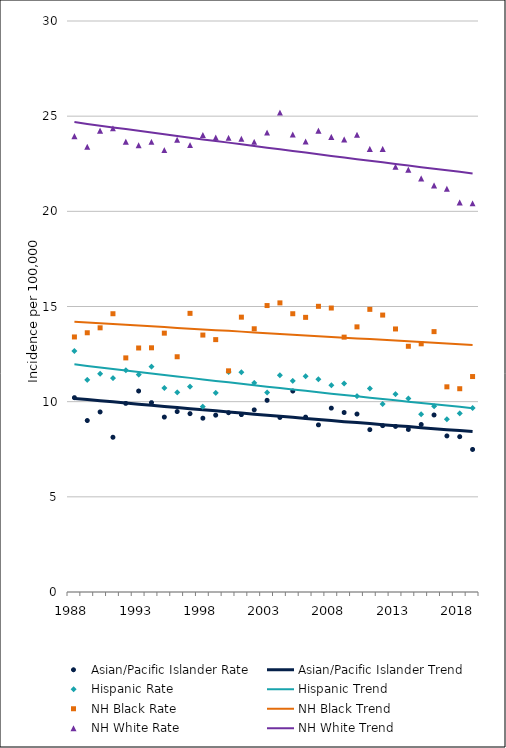
| Category | Asian/Pacific Islander Rate | Asian/Pacific Islander Trend | Hispanic Rate | Hispanic Trend | NH Black Rate | NH Black Trend | NH White Rate | NH White Trend |
|---|---|---|---|---|---|---|---|---|
| 1988.0 | 10.21 | 10.17 | 12.66 | 11.97 | 13.4 | 14.2 | 23.95 | 24.69 |
| 1989.0 | 9.01 | 10.11 | 11.15 | 11.88 | 13.62 | 14.16 | 23.39 | 24.59 |
| 1990.0 | 9.46 | 10.05 | 11.47 | 11.8 | 13.88 | 14.12 | 24.24 | 24.5 |
| 1991.0 | 8.13 | 9.99 | 11.24 | 11.72 | 14.62 | 14.08 | 24.36 | 24.41 |
| 1992.0 | 9.91 | 9.93 | 11.65 | 11.64 | 12.3 | 14.04 | 23.66 | 24.32 |
| 1993.0 | 10.56 | 9.87 | 11.42 | 11.56 | 12.82 | 14 | 23.47 | 24.23 |
| 1994.0 | 9.95 | 9.81 | 11.84 | 11.48 | 12.83 | 13.96 | 23.65 | 24.14 |
| 1995.0 | 9.19 | 9.75 | 10.72 | 11.4 | 13.6 | 13.92 | 23.22 | 24.05 |
| 1996.0 | 9.48 | 9.69 | 10.49 | 11.32 | 12.36 | 13.87 | 23.76 | 23.96 |
| 1997.0 | 9.37 | 9.63 | 10.79 | 11.25 | 14.64 | 13.83 | 23.48 | 23.87 |
| 1998.0 | 9.13 | 9.57 | 9.74 | 11.17 | 13.5 | 13.79 | 24.01 | 23.78 |
| 1999.0 | 9.29 | 9.52 | 10.46 | 11.09 | 13.26 | 13.75 | 23.88 | 23.69 |
| 2000.0 | 9.42 | 9.46 | 11.56 | 11.02 | 11.62 | 13.72 | 23.86 | 23.61 |
| 2001.0 | 9.32 | 9.4 | 11.55 | 10.94 | 14.44 | 13.68 | 23.81 | 23.52 |
| 2002.0 | 9.57 | 9.34 | 10.99 | 10.86 | 13.83 | 13.64 | 23.65 | 23.43 |
| 2003.0 | 10.07 | 9.29 | 10.48 | 10.79 | 15.05 | 13.6 | 24.14 | 23.34 |
| 2004.0 | 9.17 | 9.23 | 11.39 | 10.72 | 15.19 | 13.56 | 25.19 | 23.26 |
| 2005.0 | 10.56 | 9.18 | 11.09 | 10.64 | 14.62 | 13.52 | 24.04 | 23.17 |
| 2006.0 | 9.19 | 9.12 | 11.33 | 10.57 | 14.43 | 13.48 | 23.67 | 23.09 |
| 2007.0 | 8.78 | 9.06 | 11.18 | 10.5 | 15.01 | 13.44 | 24.24 | 23 |
| 2008.0 | 9.66 | 9.01 | 10.86 | 10.42 | 14.92 | 13.4 | 23.91 | 22.91 |
| 2009.0 | 9.43 | 8.95 | 10.96 | 10.35 | 13.39 | 13.36 | 23.78 | 22.83 |
| 2010.0 | 9.35 | 8.9 | 10.29 | 10.28 | 13.93 | 13.32 | 24.02 | 22.74 |
| 2011.0 | 8.53 | 8.85 | 10.69 | 10.21 | 14.85 | 13.29 | 23.28 | 22.66 |
| 2012.0 | 8.74 | 8.79 | 9.88 | 10.14 | 14.55 | 13.25 | 23.28 | 22.58 |
| 2013.0 | 8.7 | 8.74 | 10.4 | 10.07 | 13.82 | 13.21 | 22.34 | 22.49 |
| 2014.0 | 8.54 | 8.69 | 10.17 | 10 | 12.91 | 13.17 | 22.19 | 22.41 |
| 2015.0 | 8.8 | 8.63 | 9.34 | 9.93 | 13.04 | 13.13 | 21.73 | 22.32 |
| 2016.0 | 9.3 | 8.58 | 9.76 | 9.86 | 13.68 | 13.09 | 21.36 | 22.24 |
| 2017.0 | 8.2 | 8.53 | 9.08 | 9.8 | 10.78 | 13.06 | 21.19 | 22.16 |
| 2018.0 | 8.16 | 8.48 | 9.38 | 9.73 | 10.68 | 13.02 | 20.47 | 22.08 |
| 2019.0 | 7.49 | 8.43 | 9.67 | 9.66 | 11.32 | 12.98 | 20.42 | 21.99 |